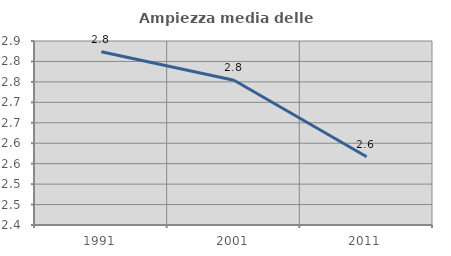
| Category | Ampiezza media delle famiglie |
|---|---|
| 1991.0 | 2.824 |
| 2001.0 | 2.754 |
| 2011.0 | 2.567 |